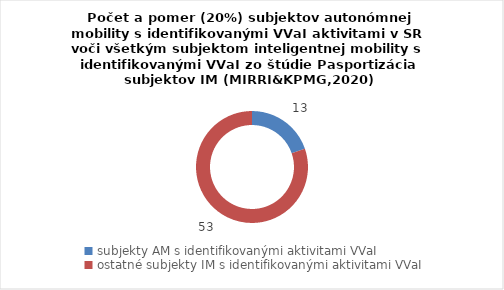
| Category | Series 0 |
|---|---|
| subjekty AM s identifikovanými aktivitami VVaI | 13 |
| ostatné subjekty IM s identifikovanými aktivitami VVaI | 53 |